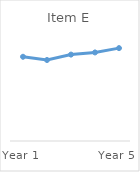
| Category | Item E |
|---|---|
| Year 1 | 0.78 |
| Year 2 | 0.75 |
| Year 3 | 0.8 |
| Year 4 | 0.82 |
| Year 5 | 0.86 |